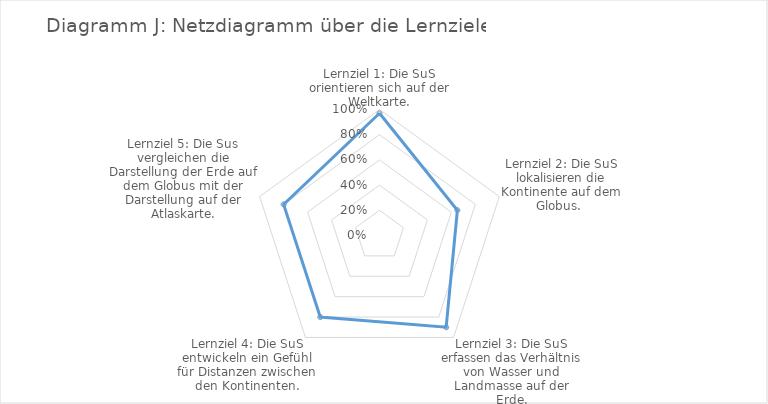
| Category | Series 0 |
|---|---|
| Lernziel 1: Die SuS orientieren sich auf der Weltkarte.
 | 0.97 |
| Lernziel 2: Die SuS lokalisieren die Kontinente auf dem Globus.  | 0.65 |
| Lernziel 3: Die SuS erfassen das Verhältnis von Wasser und Landmasse auf der Erde. | 0.9 |
| Lernziel 4: Die SuS entwickeln ein Gefühl für Distanzen zwischen den Kontinenten. | 0.8 |
| Lernziel 5: Die Sus vergleichen die Darstellung der Erde auf dem Globus mit der Darstellung auf der Atlaskarte.
 | 0.8 |